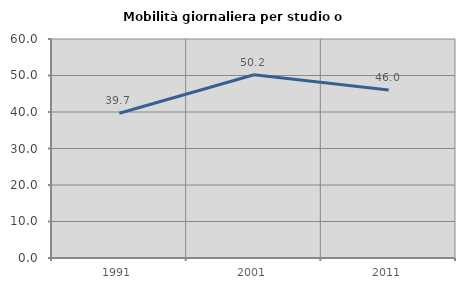
| Category | Mobilità giornaliera per studio o lavoro |
|---|---|
| 1991.0 | 39.655 |
| 2001.0 | 50.195 |
| 2011.0 | 46.016 |